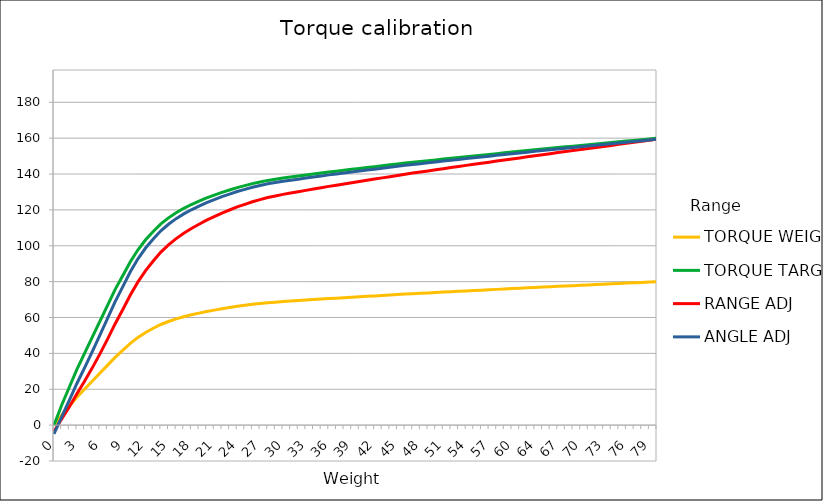
| Category | TORQUE WEIGHT | TORQUE TARGET | RANGE ADJ | ANGLE ADJ |
|---|---|---|---|---|
| 0.0 | 0 | 0 | -3.511 | -4.903 |
| 1.0 | 5.556 | 11.111 | 3.392 | 4.659 |
| 2.0 | 10.556 | 21.111 | 10.169 | 13.743 |
| 3.0 | 15.556 | 31.111 | 17.479 | 23.222 |
| 4.0 | 20 | 40 | 24.425 | 31.937 |
| 5.0 | 24.444 | 48.889 | 31.792 | 40.885 |
| 6.0 | 28.889 | 57.778 | 39.582 | 50.029 |
| 7.0 | 33.333 | 66.667 | 47.793 | 59.335 |
| 8.0 | 37.778 | 75.556 | 56.425 | 68.769 |
| 9.0 | 41.667 | 83.333 | 64.325 | 77.104 |
| 10.0 | 45.556 | 91.111 | 72.548 | 85.492 |
| 11.0 | 48.889 | 97.778 | 79.853 | 92.71 |
| 12.0 | 51.667 | 103.333 | 86.121 | 98.736 |
| 13.0 | 54 | 108 | 91.514 | 103.801 |
| 14.0 | 56.111 | 112.222 | 96.494 | 108.383 |
| 15.0 | 57.778 | 115.556 | 100.492 | 111.998 |
| 16.0 | 59.222 | 118.444 | 104.005 | 115.128 |
| 17.0 | 60.444 | 120.889 | 107.013 | 117.775 |
| 18.0 | 61.5 | 123 | 109.636 | 120.058 |
| 19.0 | 62.444 | 124.889 | 112.003 | 122.099 |
| 20.0 | 63.333 | 126.667 | 114.248 | 124.017 |
| 21.0 | 64.111 | 128.222 | 116.227 | 125.695 |
| 22.0 | 64.889 | 129.778 | 118.218 | 127.371 |
| 23.0 | 65.556 | 131.111 | 119.935 | 128.806 |
| 24.0 | 66.222 | 132.444 | 121.662 | 130.239 |
| 25.0 | 66.778 | 133.556 | 123.108 | 131.433 |
| 26.0 | 67.333 | 134.667 | 124.561 | 132.626 |
| 27.0 | 67.778 | 135.556 | 125.728 | 133.579 |
| 28.0 | 68.222 | 136.444 | 126.899 | 134.532 |
| 29.0 | 68.556 | 137.111 | 127.78 | 135.246 |
| 30.0 | 68.889 | 137.778 | 128.664 | 135.96 |
| 31.0 | 69.167 | 138.333 | 129.402 | 136.554 |
| 32.0 | 69.444 | 138.889 | 130.141 | 137.148 |
| 33.0 | 69.722 | 139.444 | 130.883 | 137.742 |
| 34.0 | 70 | 140 | 131.626 | 138.335 |
| 35.0 | 70.278 | 140.556 | 132.37 | 138.929 |
| 36.0 | 70.556 | 141.111 | 133.117 | 139.522 |
| 37.0 | 70.806 | 141.611 | 133.79 | 140.055 |
| 38.0 | 71.056 | 142.111 | 134.464 | 140.588 |
| 39.0 | 71.306 | 142.611 | 135.14 | 141.121 |
| 40.0 | 71.556 | 143.111 | 135.817 | 141.653 |
| 41.0 | 71.806 | 143.611 | 136.495 | 142.186 |
| 42.0 | 72.056 | 144.111 | 137.175 | 142.718 |
| 43.0 | 72.306 | 144.611 | 137.856 | 143.25 |
| 44.0 | 72.556 | 145.111 | 138.539 | 143.781 |
| 45.0 | 72.806 | 145.611 | 139.222 | 144.312 |
| 46.0 | 73.056 | 146.111 | 139.908 | 144.843 |
| 47.0 | 73.278 | 146.556 | 140.518 | 145.315 |
| 48.0 | 73.5 | 147 | 141.129 | 145.787 |
| 49.0 | 73.722 | 147.444 | 141.741 | 146.258 |
| 50.0 | 73.944 | 147.889 | 142.354 | 146.729 |
| 51.0 | 74.167 | 148.333 | 142.969 | 147.2 |
| 52.0 | 74.389 | 148.778 | 143.584 | 147.67 |
| 53.0 | 74.611 | 149.222 | 144.2 | 148.141 |
| 54.0 | 74.833 | 149.667 | 144.818 | 148.611 |
| 55.0 | 75.056 | 150.111 | 145.436 | 149.081 |
| 56.0 | 75.267 | 150.533 | 146.025 | 149.527 |
| 57.0 | 75.478 | 150.956 | 146.614 | 149.973 |
| 58.0 | 75.689 | 151.378 | 147.205 | 150.419 |
| 59.0 | 75.9 | 151.8 | 147.796 | 150.864 |
| 60.0 | 76.111 | 152.222 | 148.389 | 151.31 |
| 62.0 | 76.322 | 152.644 | 148.982 | 151.755 |
| 63.0 | 76.533 | 153.067 | 149.576 | 152.199 |
| 64.0 | 76.744 | 153.489 | 150.171 | 152.644 |
| 65.0 | 76.956 | 153.911 | 150.768 | 153.089 |
| 66.0 | 77.167 | 154.333 | 151.365 | 153.533 |
| 67.0 | 77.378 | 154.756 | 151.963 | 153.977 |
| 68.0 | 77.578 | 155.156 | 152.53 | 154.397 |
| 69.0 | 77.778 | 155.556 | 153.099 | 154.817 |
| 70.0 | 77.978 | 155.956 | 153.668 | 155.237 |
| 71.0 | 78.178 | 156.356 | 154.238 | 155.657 |
| 72.0 | 78.378 | 156.756 | 154.809 | 156.076 |
| 73.0 | 78.578 | 157.156 | 155.381 | 156.496 |
| 74.0 | 78.778 | 157.556 | 155.953 | 156.915 |
| 75.0 | 78.978 | 157.956 | 156.527 | 157.334 |
| 76.0 | 79.178 | 158.356 | 157.101 | 157.752 |
| 77.0 | 79.378 | 158.756 | 157.676 | 158.171 |
| 78.0 | 79.578 | 159.156 | 158.252 | 158.589 |
| 79.0 | 79.778 | 159.556 | 158.829 | 159.007 |
| 80.0 | 79.978 | 159.956 | 159.407 | 159.425 |